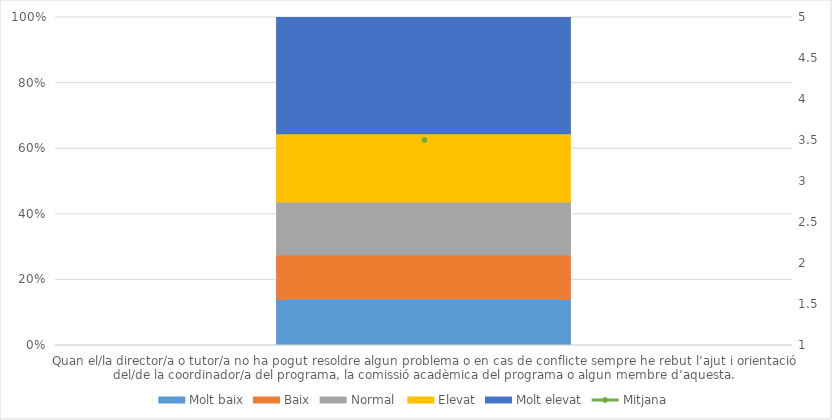
| Category | Molt baix | Baix | Normal  | Elevat | Molt elevat |
|---|---|---|---|---|---|
| Quan el/la director/a o tutor/a no ha pogut resoldre algun problema o en cas de conflicte sempre he rebut l’ajut i orientació del/de la coordinador/a del programa, la comissió acadèmica del programa o algun membre d’aquesta. | 27 | 26 | 31 | 40 | 68 |